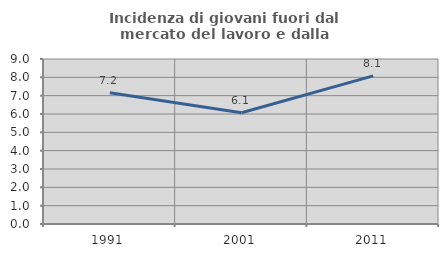
| Category | Incidenza di giovani fuori dal mercato del lavoro e dalla formazione  |
|---|---|
| 1991.0 | 7.155 |
| 2001.0 | 6.068 |
| 2011.0 | 8.08 |